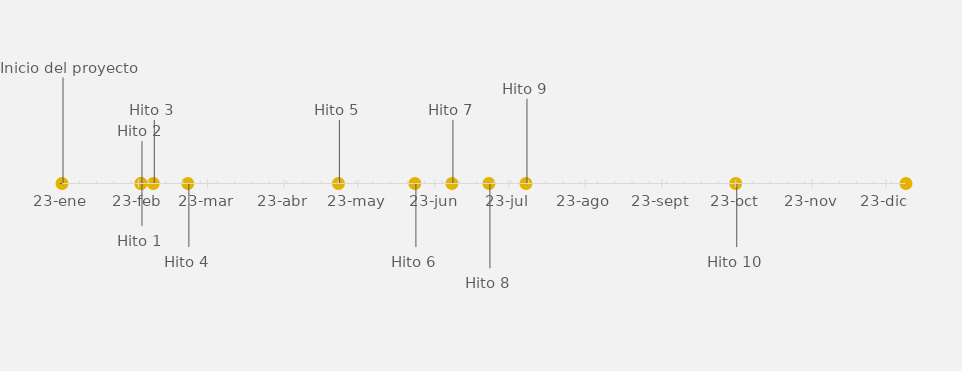
| Category | POSICIÓN |
|---|---|
| Inicio del proyecto | 25 |
| Hito 1 | -10 |
| Hito 2 | 10 |
| Hito 3 | 15 |
| Hito 4 | -15 |
| Hito 5 | 15 |
| Hito 6 | -15 |
| Hito 7 | 15 |
| Hito 8 | -20 |
| Hito 9 | 20 |
| Hito 10 | -15 |
| Final del proyecto | 15 |